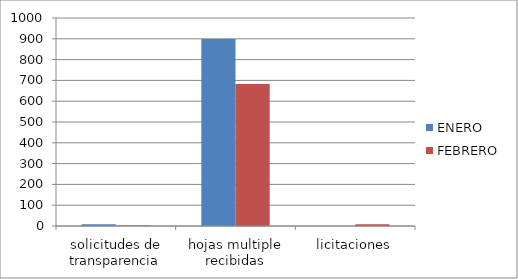
| Category | ENERO | FEBRERO |
|---|---|---|
| solicitudes de transparencia | 8 | 2 |
| hojas multiple recibidas | 899 | 683 |
| licitaciones | 0 | 8 |